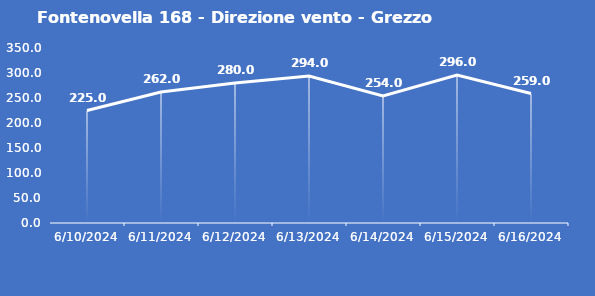
| Category | Fontenovella 168 - Direzione vento - Grezzo (°N) |
|---|---|
| 6/10/24 | 225 |
| 6/11/24 | 262 |
| 6/12/24 | 280 |
| 6/13/24 | 294 |
| 6/14/24 | 254 |
| 6/15/24 | 296 |
| 6/16/24 | 259 |